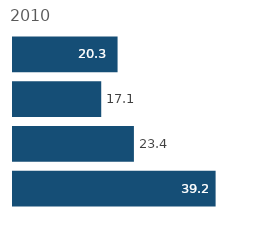
| Category | Series 0 |
|---|---|
| 0 | 39.241 |
| 1 | 23.418 |
| 2 | 17.089 |
| 3 | 20.253 |